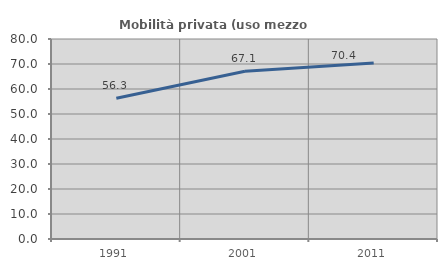
| Category | Mobilità privata (uso mezzo privato) |
|---|---|
| 1991.0 | 56.332 |
| 2001.0 | 67.104 |
| 2011.0 | 70.402 |